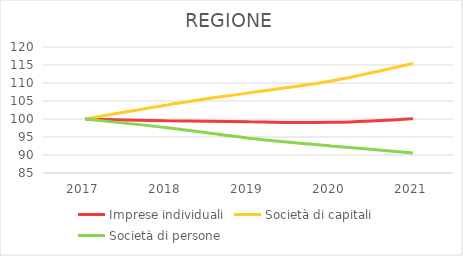
| Category | Imprese individuali | Società di capitali | Società di persone |
|---|---|---|---|
| 2017.0 | 100 | 100 | 100 |
| 2018.0 | 99.492 | 103.909 | 97.59 |
| 2019.0 | 99.216 | 107.26 | 94.671 |
| 2020.0 | 99.065 | 110.555 | 92.53 |
| 2021.0 | 100.038 | 115.439 | 90.576 |